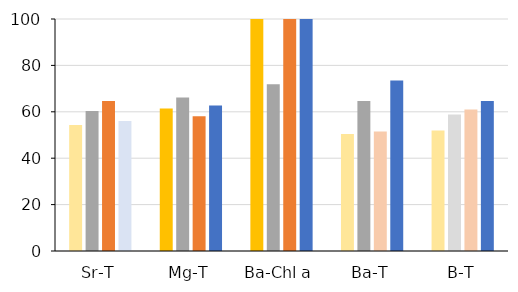
| Category | FO | IOM | ICE | GOM |
|---|---|---|---|---|
| Sr-T | 54.286 | 60.294 | 64.706 | 56 |
| Mg-T | 61.468 | 66.176 | 58.088 | 62.745 |
| Ba-Chl a | 100 | 71.875 | 100 | 100 |
| Ba-T | 50.382 | 64.706 | 51.471 | 73.469 |
| B-T | 51.887 | 58.824 | 61.029 | 64.706 |